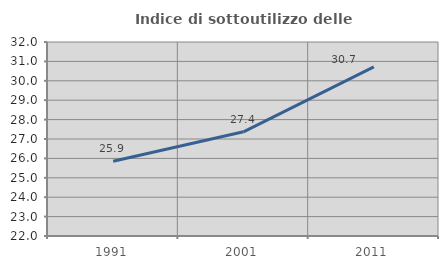
| Category | Indice di sottoutilizzo delle abitazioni  |
|---|---|
| 1991.0 | 25.852 |
| 2001.0 | 27.37 |
| 2011.0 | 30.72 |